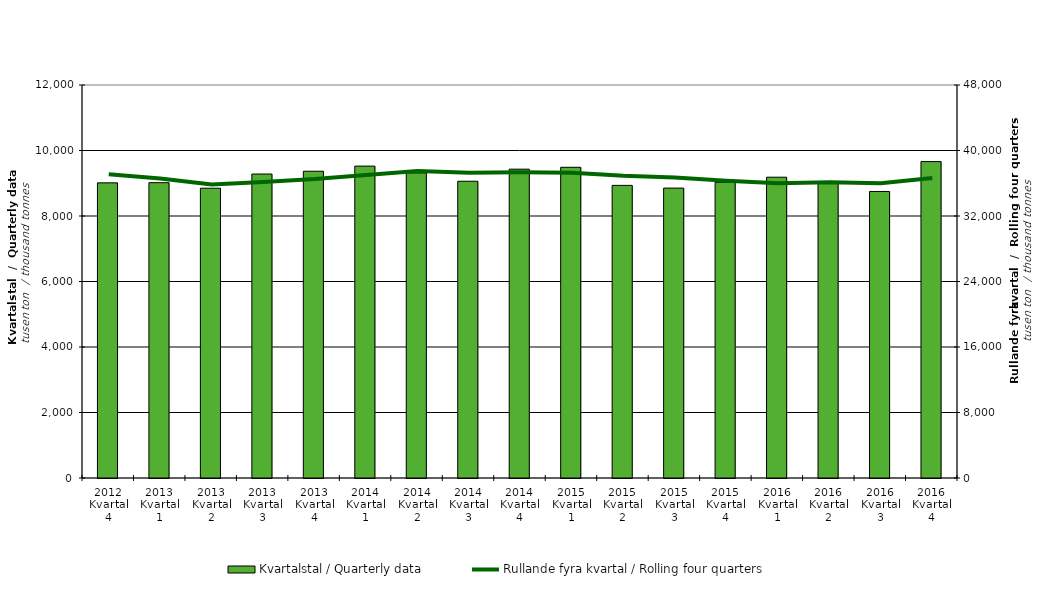
| Category | Kvartalstal / Quarterly data |
|---|---|
| 2012 Kvartal 4 | 9012.201 |
| 2013 Kvartal 1 | 9017.274 |
| 2013 Kvartal 2 | 8848.116 |
| 2013 Kvartal 3 | 9281.962 |
| 2013 Kvartal 4 | 9366.582 |
| 2014 Kvartal 1 | 9522.959 |
| 2014 Kvartal 2 | 9317.252 |
| 2014 Kvartal 3 | 9061.085 |
| 2014 Kvartal 4 | 9429.997 |
| 2015 Kvartal 1 | 9487.322 |
| 2015 Kvartal 2 | 8934.904 |
| 2015 Kvartal 3 | 8852.08 |
| 2015 Kvartal 4 | 9028.415 |
| 2016 Kvartal 1 | 9184.235 |
| 2016 Kvartal 2 | 9046.932 |
| 2016 Kvartal 3 | 8749.393 |
| 2016 Kvartal 4 | 9661.27 |